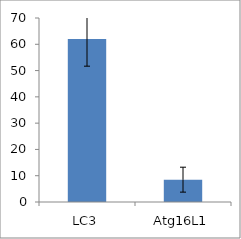
| Category | Series 0 |
|---|---|
| LC3 | 62 |
| Atg16L1 | 8.5 |